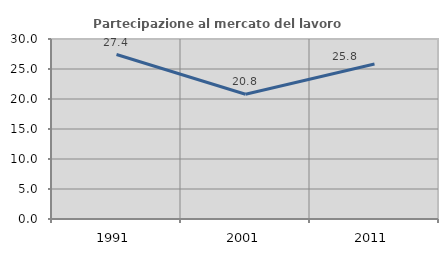
| Category | Partecipazione al mercato del lavoro  femminile |
|---|---|
| 1991.0 | 27.407 |
| 2001.0 | 20.801 |
| 2011.0 | 25.841 |